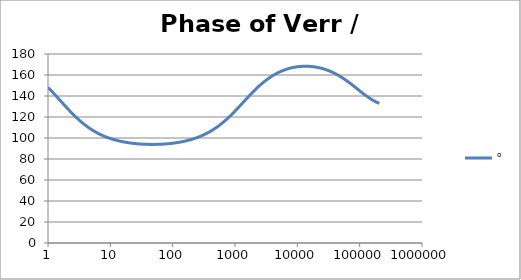
| Category | ° |
|---|---|
| 1.0 | 148.128 |
| 1.0634378492473788 | 146.529 |
| 1.1309000592118907 | 144.891 |
| 1.2026419266820265 | 143.218 |
| 1.278934943925458 | 141.517 |
| 1.3600678260954062 | 139.792 |
| 1.4463476038134566 | 138.05 |
| 1.5381007850634825 | 136.296 |
| 1.6356745907936145 | 134.539 |
| 1.739438268902148 | 132.783 |
| 1.849784491579884 | 131.037 |
| 1.967130841296868 | 129.306 |
| 2.091921391056928 | 127.596 |
| 2.2246283849001642 | 125.914 |
| 2.365754025012901 | 124.264 |
| 2.5158323722080485 | 122.652 |
| 2.6754313669678584 | 121.082 |
| 2.8451549786972743 | 119.557 |
| 3.025645491321301 | 118.08 |
| 3.2175859338757533 | 116.654 |
| 3.42170266528945 | 115.281 |
| 3.6387681231394358 | 113.961 |
| 3.8696037467813236 | 112.696 |
| 4.115083085916729 | 111.486 |
| 4.376135106361553 | 110.33 |
| 4.653747705525078 | 109.228 |
| 4.948971450903514 | 108.18 |
| 5.262923555735513 | 107.184 |
| 5.596792106864742 | 106.239 |
| 5.951840560808945 | 105.343 |
| 6.329412525049976 | 104.496 |
| 6.730936842638569 | 103.695 |
| 7.157932999355504 | 102.938 |
| 7.612016873891456 | 102.225 |
| 8.094906852805886 | 101.553 |
| 8.608430333405762 | 100.92 |
| 9.154530639152917 | 100.325 |
| 9.735274373770007 | 99.766 |
| 10.352859241875105 | 99.242 |
| 11.009622365740512 | 98.751 |
| 11.708049129648925 | 98.291 |
| 12.4507825853165 | 97.861 |
| 13.240633453975693 | 97.459 |
| 14.080590762968805 | 97.085 |
| 14.973833157104059 | 96.736 |
| 15.923740927579823 | 96.413 |
| 16.93390880399795 | 96.113 |
| 18.008159557874837 | 95.836 |
| 19.150558469130036 | 95.58 |
| 20.365428710297824 | 95.345 |
| 21.65736770667993 | 95.13 |
| 23.031264534351347 | 94.935 |
| 24.492318421858034 | 94.758 |
| 26.046058425622668 | 94.598 |
| 27.698364353515743 | 94.456 |
| 29.45548901577305 | 94.331 |
| 31.32408188746347 | 94.222 |
| 33.311214272052936 | 94.129 |
| 35.42440606129053 | 94.051 |
| 37.67165419268462 | 93.989 |
| 40.06146291225952 | 93.941 |
| 42.60287595711691 | 93.909 |
| 45.30551077958928 | 93.891 |
| 48.17959494250036 | 93.888 |
| 51.23600482326248 | 93.9 |
| 54.486306773278585 | 93.926 |
| 57.94280088840825 | 93.967 |
| 61.61856755613799 | 94.023 |
| 65.52751695560372 | 94.095 |
| 69.68444169778837 | 94.181 |
| 74.10507280510043 | 94.284 |
| 78.80613924217637 | 94.402 |
| 83.8054312231895 | 94.538 |
| 89.12186753523771 | 94.69 |
| 94.77556713258299 | 94.859 |
| 100.78792527267464 | 95.047 |
| 107.18169448207877 | 95.254 |
| 113.98107065871142 | 95.481 |
| 121.21178463621371 | 95.727 |
| 128.90119955697148 | 95.996 |
| 137.07841442227294 | 96.286 |
| 145.77437421146283 | 96.6 |
| 155.02198698682062 | 96.937 |
| 164.85624842731968 | 97.301 |
| 175.3143742625403 | 97.691 |
| 186.43594110790573 | 98.109 |
| 198.26303623420247 | 98.556 |
| 210.84041683815525 | 99.034 |
| 224.21567941678887 | 99.544 |
| 238.43943988652958 | 100.088 |
| 253.56552512868072 | 100.667 |
| 269.65117668612646 | 101.284 |
| 286.75726738211927 | 101.938 |
| 304.9485316808965 | 102.634 |
| 324.2938106618788 | 103.371 |
| 344.8663125345048 | 104.152 |
| 366.7438896795682 | 104.979 |
| 390.00933326545766 | 105.852 |
| 414.7506865542229 | 106.774 |
| 441.06157808309626 | 107.746 |
| 469.0415759823428 | 108.77 |
| 498.7965647702637 | 109.845 |
| 530.4391460512702 | 110.974 |
| 564.089064633379 | 112.157 |
| 599.8736616776864 | 113.393 |
| 637.9283565946681 | 114.683 |
| 678.3971595109495 | 116.026 |
| 721.4332162458546 | 117.421 |
| 767.1993878601115 | 118.865 |
| 815.868866969862 | 120.358 |
| 867.6258331583267 | 121.895 |
| 922.6661499653554 | 123.474 |
| 981.1981060925172 | 125.089 |
| 1043.443203628628 | 126.737 |
| 1109.6369962786232 | 128.412 |
| 1180.0299807678607 | 130.107 |
| 1254.8885447951977 | 131.818 |
| 1334.4959751221782 | 133.538 |
| 1419.1535296132129 | 135.258 |
| 1509.1815772837017 | 136.974 |
| 1604.9208106703452 | 138.678 |
| 1706.7335351116335 | 140.363 |
| 1815.0050398174897 | 142.024 |
| 1930.1450559166665 | 143.654 |
| 2052.58930699948 | 145.248 |
| 2182.801158023697 | 146.8 |
| 2321.2733688234066 | 148.308 |
| 2468.5299588567814 | 149.766 |
| 2625.128190249376 | 151.172 |
| 2791.6606766374607 | 152.523 |
| 2968.757625791824 | 153.818 |
| 3157.08922450881 | 155.054 |
| 3357.3681747937244 | 156.232 |
| 3570.352390934236 | 157.349 |
| 3796.8478676703417 | 158.408 |
| 4037.7117303148448 | 159.406 |
| 4293.8554783669315 | 160.346 |
| 4566.248434893605 | 161.228 |
| 4855.9214147324665 | 162.052 |
| 5163.970625397384 | 162.82 |
| 5491.561815449236 | 163.532 |
| 5839.934686030357 | 164.191 |
| 6210.40758225729 | 164.797 |
| 6604.382482225307 | 165.351 |
| 7023.350302504747 | 165.855 |
| 7468.896540206577 | 166.309 |
| 7942.707272968458 | 166.716 |
| 8446.575539567106 | 167.075 |
| 8982.408125302747 | 167.388 |
| 9552.232777834151 | 167.655 |
| 10158.205880770249 | 167.878 |
| 10802.620614058389 | 168.057 |
| 11487.915632049675 | 168.192 |
| 12216.684292082227 | 168.284 |
| 12991.684468506162 | 168.333 |
| 13815.848989288772 | 168.34 |
| 14692.296734695852 | 168.304 |
| 15624.344440049217 | 168.225 |
| 16615.519247226184 | 168.104 |
| 17669.572052398642 | 167.94 |
| 18790.49170052441 | 167.733 |
| 19982.5200803064 | 167.482 |
| 21250.168176743602 | 167.187 |
| 22598.233142021272 | 166.847 |
| 24031.816449341983 | 166.462 |
| 25556.34319839602 | 166.031 |
| 27177.582645530147 | 165.553 |
| 28901.67003630542 | 165.028 |
| 30735.129823066054 | 164.454 |
| 32684.900355380338 | 163.833 |
| 34758.3601367905 | 163.162 |
| 36963.35574723439 | 162.442 |
| 39308.23153680468 | 161.672 |
| 41801.861203217486 | 160.853 |
| 44453.68137248706 | 159.985 |
| 47273.727309885995 | 159.068 |
| 50272.670896332245 | 158.103 |
| 53461.86101391677 | 157.092 |
| 56853.36649340195 | 156.038 |
| 60460.02178621637 | 154.941 |
| 64295.47553378361 | 153.806 |
| 68374.24221798431 | 152.636 |
| 72711.75708821259 | 151.436 |
| 77324.43457288652 | 150.211 |
| 82229.73039646025 | 148.966 |
| 87446.2076370035 | 147.707 |
| 92993.60697433475 | 146.442 |
| 98892.92139454243 | 145.178 |
| 105166.47563360249 | 143.923 |
| 111838.01066072512 | 142.684 |
| 118932.77352114675 | 141.471 |
| 126477.61287835392 | 140.292 |
| 134501.0806172993 | 139.155 |
| 143033.53989310883 | 138.067 |
| 152107.28003416685 | 137.038 |
| 161756.63873440344 | 136.074 |
| 172018.1319971993 | 135.183 |
| 182930.592322653 | 134.371 |
| 194535.31566115122 | 133.643 |
| 206876.217689355 | 133.005 |